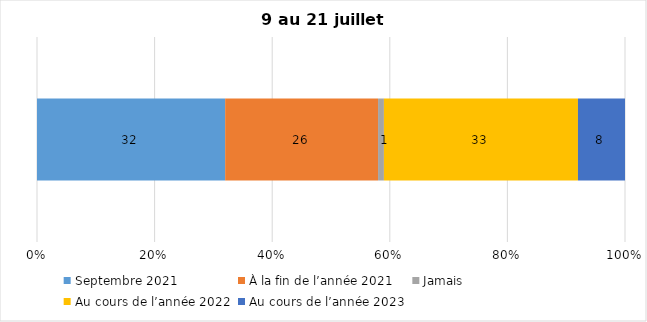
| Category | Septembre 2021 | À la fin de l’année 2021 | Jamais | Au cours de l’année 2022 | Au cours de l’année 2023 |
|---|---|---|---|---|---|
| 0 | 32 | 26 | 1 | 33 | 8 |